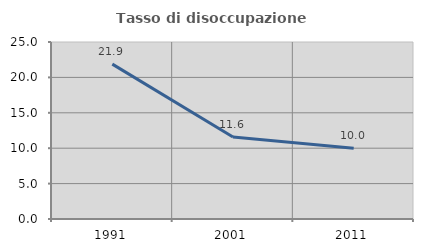
| Category | Tasso di disoccupazione giovanile  |
|---|---|
| 1991.0 | 21.875 |
| 2001.0 | 11.594 |
| 2011.0 | 10 |